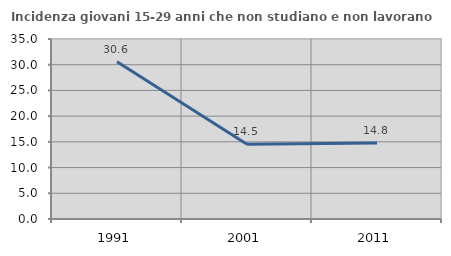
| Category | Incidenza giovani 15-29 anni che non studiano e non lavorano  |
|---|---|
| 1991.0 | 30.556 |
| 2001.0 | 14.53 |
| 2011.0 | 14.786 |